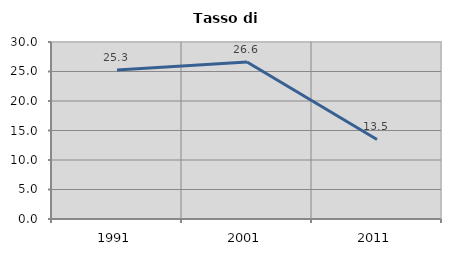
| Category | Tasso di disoccupazione   |
|---|---|
| 1991.0 | 25.263 |
| 2001.0 | 26.598 |
| 2011.0 | 13.477 |